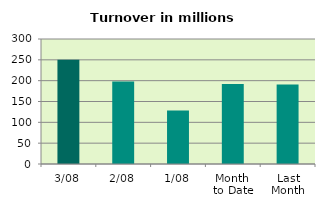
| Category | Series 0 |
|---|---|
| 3/08 | 250.188 |
| 2/08 | 198.087 |
| 1/08 | 128.341 |
| Month 
to Date | 192.205 |
| Last
Month | 191.038 |